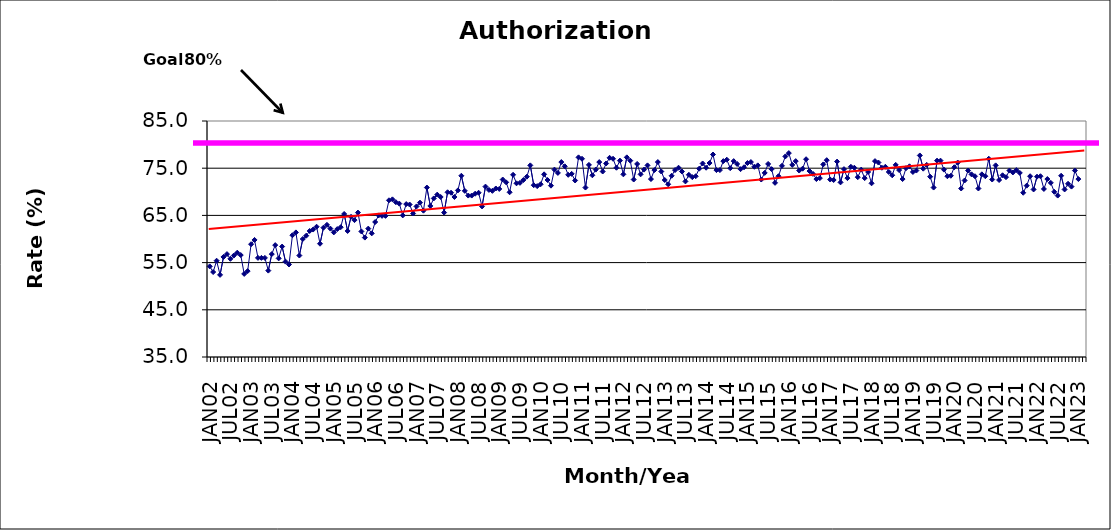
| Category | Series 0 |
|---|---|
| JAN02 | 54.2 |
| FEB02 | 53 |
| MAR02 | 55.4 |
| APR02 | 52.4 |
| MAY02 | 56.2 |
| JUN02 | 56.8 |
| JUL02 | 55.8 |
| AUG02 | 56.5 |
| SEP02 | 57.1 |
| OCT02 | 56.6 |
| NOV02 | 52.6 |
| DEC02 | 53.2 |
| JAN03 | 58.9 |
| FEB03 | 59.8 |
| MAR03 | 56 |
| APR03 | 56 |
| MAY03 | 56 |
| JUN03 | 53.3 |
| JUL03 | 56.8 |
| AUG03 | 58.7 |
| SEP03 | 55.9 |
| OCT03 | 58.4 |
| NOV03 | 55.2 |
| DEC03 | 54.6 |
| JAN04 | 60.8 |
| FEB04 | 61.4 |
| MAR04 | 56.5 |
| APR04 | 60 |
| MAY04 | 60.7 |
| JUN04 | 61.7 |
| JUL04 | 62 |
| AUG04 | 62.6 |
| SEP04 | 59 |
| OCT04 | 62.4 |
| NOV04 | 63 |
| DEC04 | 62.2 |
| JAN05 | 61.4 |
| FEB05 | 62.1 |
| MAR05 | 62.5 |
| APR05 | 65.3 |
| MAY05 | 61.7 |
| JUN05 | 64.7 |
| JUL05 | 64 |
| AUG05 | 65.6 |
| SEP05 | 61.6 |
| OCT05 | 60.3 |
| NOV05 | 62.2 |
| DEC05 | 61.2 |
| JAN06 | 63.6 |
| FEB06 | 65 |
| MAR06 | 64.9 |
| APR06 | 64.9 |
| MAY06 | 68.2 |
| JUN06 | 68.4 |
| JUL06 | 67.8 |
| AUG06 | 67.5 |
| SEP06 | 65 |
| OCT06 | 67.4 |
| NOV06 | 67.3 |
| DEC06 | 65.4 |
| JAN07 | 66.9 |
| FEB07 | 67.7 |
| MAR07 | 66 |
| APR07 | 70.9 |
| MAY07 | 67 |
| JUN07 | 68.6 |
| JUL07 | 69.4 |
| AUG07 | 68.9 |
| SEP07 | 65.6 |
| OCT07 | 69.9 |
| NOV07 | 69.8 |
| DEC07 | 68.9 |
| JAN08 | 70.3 |
| FEB08 | 73.4 |
| MAR08 | 70.2 |
| APR08 | 69.2 |
| MAY08 | 69.2 |
| JUN08 | 69.6 |
| JUL08 | 69.8 |
| AUG08 | 66.9 |
| SEP08 | 71.1 |
| OCT08 | 70.4 |
| NOV08 | 70.2 |
| DEC08 | 70.7 |
| JAN09 | 70.6 |
| FEB09 | 72.6 |
| MAR09 | 72 |
| APR09 | 69.9 |
| MAY09 | 73.6 |
| JUN09 | 71.8 |
| JUL09 | 71.9 |
| AUG09 | 72.5 |
| SEP09 | 73.2 |
| OCT09 | 75.6 |
| NOV09 | 71.4 |
| DEC09 | 71.2 |
| JAN10 | 71.6 |
| FEB10 | 73.7 |
| MAR10 | 72.5 |
| APR10 | 71.3 |
| MAY10 | 74.7 |
| JUN10 | 74 |
| JUL10 | 76.3 |
| AUG10 | 75.4 |
| SEP10 | 73.6 |
| OCT10 | 73.8 |
| NOV10 | 72.4 |
| DEC10 | 77.3 |
| JAN11 | 77 |
| FEB11 | 70.9 |
| MAR11 | 75.7 |
| APR11 | 73.5 |
| MAY11 | 74.7 |
| JUN11 | 76.3 |
| JUL11 | 74.3 |
| AUG11 | 76 |
| SEP11 | 77.2 |
| OCT11 | 77 |
| NOV11 | 75.1 |
| DEC11 | 76.6 |
| JAN12 | 73.7 |
| FEB12 | 77.3 |
| MAR12 | 76.6 |
| APR12 | 72.6 |
| MAY12 | 75.9 |
| JUN12 | 73.7 |
| JUL12 | 74.7 |
| AUG12 | 75.6 |
| SEP12 | 72.7 |
| OCT12 | 74.6 |
| NOV12 | 76.3 |
| DEC12 | 74.3 |
| JAN13 | 72.5 |
| FEB13 | 71.6 |
| MAR13 | 73.4 |
| APR13 | 74.6 |
| MAY13 | 75.1 |
| JUN13 | 74.3 |
| JUL13 | 72.2 |
| AUG13 | 73.6 |
| SEP13 | 73.1 |
| OCT13 | 73.3 |
| NOV13 | 74.9 |
| DEC13 | 76 |
| JAN14 | 75.1 |
| FEB14 | 76.1 |
| MAR14 | 77.9 |
| APR14 | 74.6 |
| MAY14 | 74.6 |
| JUN14 | 76.5 |
| JUL14 | 76.8 |
| AUG14 | 75 |
| SEP14 | 76.5 |
| OCT14 | 75.9 |
| NOV14 | 74.8 |
| DEC14 | 75.2 |
| JAN15 | 76.1 |
| FEB15 | 76.3 |
| MAR15 | 75.3 |
| APR15 | 75.6 |
| MAY15 | 72.6 |
| JUN15 | 74 |
| JUL15 | 75.9 |
| AUG15 | 74.8 |
| SEP15 | 71.9 |
| OCT15 | 73.3 |
| NOV15 | 75.5 |
| DEC15 | 77.5 |
| JAN16 | 78.2 |
| FEB16 | 75.7 |
| MAR16 | 76.5 |
| APR16 | 74.5 |
| MAY16 | 74.9 |
| JUN16 | 76.9 |
| JUL16 | 74.4 |
| AUG16 | 73.8 |
| SEP16 | 72.7 |
| OCT16 | 72.9 |
| NOV16 | 75.8 |
| DEC16 | 76.7 |
| JAN17 | 72.6 |
| FEB17 | 72.5 |
| MAR17 | 76.4 |
| APR17 | 72 |
| MAY17 | 74.8 |
| JUN17 | 72.9 |
| JUL17 | 75.3 |
| AUG17 | 75.1 |
| SEP17 | 73.1 |
| OCT17 | 74.7 |
| NOV17 | 72.9 |
| DEC17 | 74.2 |
| JAN18 | 71.8 |
| FEB18 | 76.5 |
| MAR18 | 76.2 |
| APR18 | 75.1 |
| MAY18 | 75.3 |
| JUN18 | 74.2 |
| JUL18 | 73.5 |
| AUG18 | 75.7 |
| SEP18 | 74.6 |
| OCT18 | 72.7 |
| NOV18 | 75 |
| DEC18 | 75.4 |
| JAN19 | 74.2 |
| FEB19 | 74.5 |
| MAR19 | 77.7 |
| APR19 | 74.9 |
| MAY19 | 75.7 |
| JUN19 | 73.2 |
| JUL19 | 70.9 |
| AUG19 | 76.6 |
| SEP19 | 76.6 |
| OCT19 | 74.7 |
| NOV19 | 73.3 |
| DEC19 | 73.4 |
| JAN20 | 75.2 |
| FEB20 | 76.2 |
| MAR20 | 70.7 |
| APR20 | 72.4 |
| MAY20 | 74.5 |
| JUN20 | 73.7 |
| JUL20 | 73.3 |
| AUG20 | 70.7 |
| SEP20 | 73.7 |
| OCT20 | 73.3 |
| NOV20 | 77 |
| DEC20 | 72.6 |
| JAN21 | 75.6 |
| FEB21 | 72.5 |
| MAR21 | 73.5 |
| APR21 | 73.1 |
| MAY21 | 74.5 |
| JUN21 | 74.1 |
| JUL21 | 74.6 |
| AUG21 | 74 |
| SEP21 | 69.8 |
| OCT21 | 71.3 |
| NOV21 | 73.3 |
| DEC21 | 70.5 |
| JAN22 | 73.2 |
| FEB22 | 73.3 |
| MAR22 | 70.6 |
| APR22 | 72.7 |
| MAY22 | 71.9 |
| JUN22 | 70 |
| JUL22 | 69.2 |
| AUG22 | 73.4 |
| SEP22 | 70.5 |
| OCT22 | 71.7 |
| NOV22 | 71.1 |
| DEC22 | 74.5 |
| JAN23 | 72.7 |